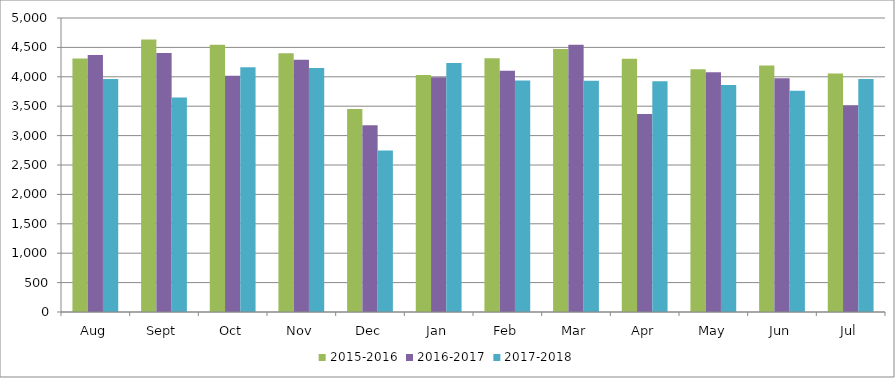
| Category | 2015-2016 | 2016-2017 | 2017-2018 |
|---|---|---|---|
| Aug | 4310 | 4370 | 3964 |
| Sept | 4633 | 4404 | 3647 |
| Oct | 4546 | 4018 | 4163 |
| Nov | 4402 | 4291 | 4151 |
| Dec | 3451 | 3177 | 2748 |
| Jan | 4030 | 3993 | 4235 |
| Feb | 4315 | 4102 | 3938 |
| Mar | 4472 | 4546 | 3931 |
| Apr | 4305 | 3368 | 3926 |
| May | 4127 | 4079 | 3861 |
| Jun | 4194 | 3974 | 3762 |
| Jul | 4057 | 3518 | 3961 |